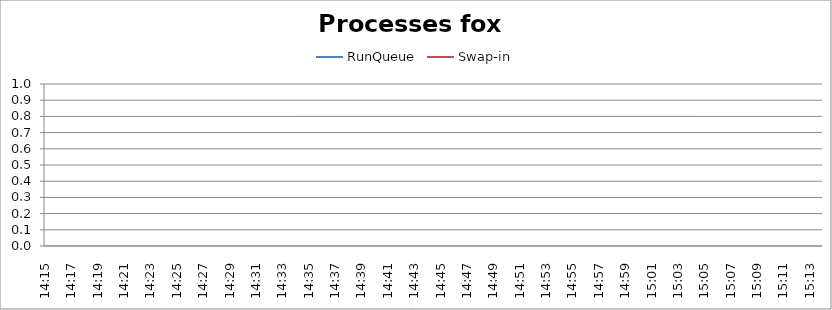
| Category | RunQueue | Swap-in |
|---|---|---|
| 14:15 | -1 | -1 |
| 14:16 | -1 | -1 |
| 14:17 | -1 | -1 |
| 14:18 | -1 | -1 |
| 14:19 | -1 | -1 |
| 14:20 | -1 | -1 |
| 14:21 | -1 | -1 |
| 14:22 | -1 | -1 |
| 14:23 | -1 | -1 |
| 14:24 | -1 | -1 |
| 14:25 | -1 | -1 |
| 14:26 | -1 | -1 |
| 14:27 | -1 | -1 |
| 14:28 | -1 | -1 |
| 14:29 | -1 | -1 |
| 14:30 | -1 | -1 |
| 14:31 | -1 | -1 |
| 14:32 | -1 | -1 |
| 14:33 | -1 | -1 |
| 14:34 | -1 | -1 |
| 14:35 | -1 | -1 |
| 14:36 | -1 | -1 |
| 14:37 | -1 | -1 |
| 14:38 | -1 | -1 |
| 14:39 | -1 | -1 |
| 14:40 | -1 | -1 |
| 14:41 | -1 | -1 |
| 14:42 | -1 | -1 |
| 14:43 | -1 | -1 |
| 14:44 | -1 | -1 |
| 14:45 | -1 | -1 |
| 14:46 | -1 | -1 |
| 14:47 | -1 | -1 |
| 14:48 | -1 | -1 |
| 14:49 | -1 | -1 |
| 14:50 | -1 | -1 |
| 14:51 | -1 | -1 |
| 14:52 | -1 | -1 |
| 14:53 | -1 | -1 |
| 14:54 | -1 | -1 |
| 14:55 | -1 | -1 |
| 14:56 | -1 | -1 |
| 14:57 | -1 | -1 |
| 14:58 | -1 | -1 |
| 14:59 | -1 | -1 |
| 15:00 | -1 | -1 |
| 15:01 | -1 | -1 |
| 15:02 | -1 | -1 |
| 15:03 | -1 | -1 |
| 15:04 | -1 | -1 |
| 15:05 | -1 | -1 |
| 15:06 | -1 | -1 |
| 15:07 | -1 | -1 |
| 15:08 | -1 | -1 |
| 15:09 | -1 | -1 |
| 15:10 | -1 | -1 |
| 15:11 | -1 | -1 |
| 15:12 | -1 | -1 |
| 15:13 | -1 | -1 |
| 15:14 | -1 | -1 |